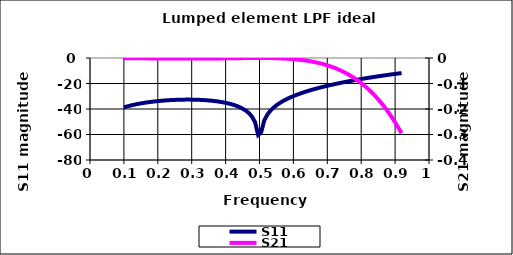
| Category | S11 |
|---|---|
| 0.1 | -38.676 |
| 0.10900000000000001 | -37.996 |
| 0.11800000000000002 | -37.382 |
| 0.12700000000000003 | -36.825 |
| 0.13600000000000004 | -36.319 |
| 0.14500000000000005 | -35.858 |
| 0.15400000000000005 | -35.438 |
| 0.16300000000000006 | -35.055 |
| 0.17200000000000007 | -34.706 |
| 0.18100000000000008 | -34.389 |
| 0.19000000000000009 | -34.103 |
| 0.1990000000000001 | -33.844 |
| 0.2080000000000001 | -33.612 |
| 0.2170000000000001 | -33.407 |
| 0.22600000000000012 | -33.226 |
| 0.23500000000000013 | -33.07 |
| 0.24400000000000013 | -32.938 |
| 0.2530000000000001 | -32.83 |
| 0.2620000000000001 | -32.746 |
| 0.27100000000000013 | -32.685 |
| 0.28000000000000014 | -32.649 |
| 0.28900000000000015 | -32.637 |
| 0.29800000000000015 | -32.651 |
| 0.30700000000000016 | -32.691 |
| 0.31600000000000017 | -32.759 |
| 0.3250000000000002 | -32.855 |
| 0.3340000000000002 | -32.982 |
| 0.3430000000000002 | -33.142 |
| 0.3520000000000002 | -33.337 |
| 0.3610000000000002 | -33.572 |
| 0.3700000000000002 | -33.849 |
| 0.3790000000000002 | -34.174 |
| 0.38800000000000023 | -34.552 |
| 0.39700000000000024 | -34.993 |
| 0.40600000000000025 | -35.506 |
| 0.41500000000000026 | -36.103 |
| 0.42400000000000027 | -36.804 |
| 0.4330000000000003 | -37.632 |
| 0.4420000000000003 | -38.623 |
| 0.4510000000000003 | -39.83 |
| 0.4600000000000003 | -41.339 |
| 0.4690000000000003 | -43.303 |
| 0.4780000000000003 | -46.036 |
| 0.4870000000000003 | -50.364 |
| 0.49600000000000033 | -60.364 |
| 0.5050000000000003 | -58.192 |
| 0.5140000000000003 | -49.018 |
| 0.5230000000000004 | -44.478 |
| 0.5320000000000004 | -41.386 |
| 0.5410000000000004 | -39.012 |
| 0.5500000000000004 | -37.071 |
| 0.5590000000000004 | -35.418 |
| 0.5680000000000004 | -33.973 |
| 0.5770000000000004 | -32.685 |
| 0.5860000000000004 | -31.519 |
| 0.5950000000000004 | -30.451 |
| 0.6040000000000004 | -29.464 |
| 0.6130000000000004 | -28.546 |
| 0.6220000000000004 | -27.685 |
| 0.6310000000000004 | -26.874 |
| 0.6400000000000005 | -26.107 |
| 0.6490000000000005 | -25.378 |
| 0.6580000000000005 | -24.683 |
| 0.6670000000000005 | -24.019 |
| 0.6760000000000005 | -23.383 |
| 0.6850000000000005 | -22.772 |
| 0.6940000000000005 | -22.183 |
| 0.7030000000000005 | -21.616 |
| 0.7120000000000005 | -21.068 |
| 0.7210000000000005 | -20.538 |
| 0.7300000000000005 | -20.024 |
| 0.7390000000000005 | -19.527 |
| 0.7480000000000006 | -19.043 |
| 0.7570000000000006 | -18.574 |
| 0.7660000000000006 | -18.117 |
| 0.7750000000000006 | -17.672 |
| 0.7840000000000006 | -17.239 |
| 0.7930000000000006 | -16.817 |
| 0.8020000000000006 | -16.405 |
| 0.8110000000000006 | -16.003 |
| 0.8200000000000006 | -15.61 |
| 0.8290000000000006 | -15.227 |
| 0.8380000000000006 | -14.852 |
| 0.8470000000000006 | -14.486 |
| 0.8560000000000006 | -14.128 |
| 0.8650000000000007 | -13.777 |
| 0.8740000000000007 | -13.434 |
| 0.8830000000000007 | -13.099 |
| 0.8920000000000007 | -12.77 |
| 0.9010000000000007 | -12.448 |
| 0.9100000000000007 | -12.133 |
| 0.9190000000000007 | -11.825 |